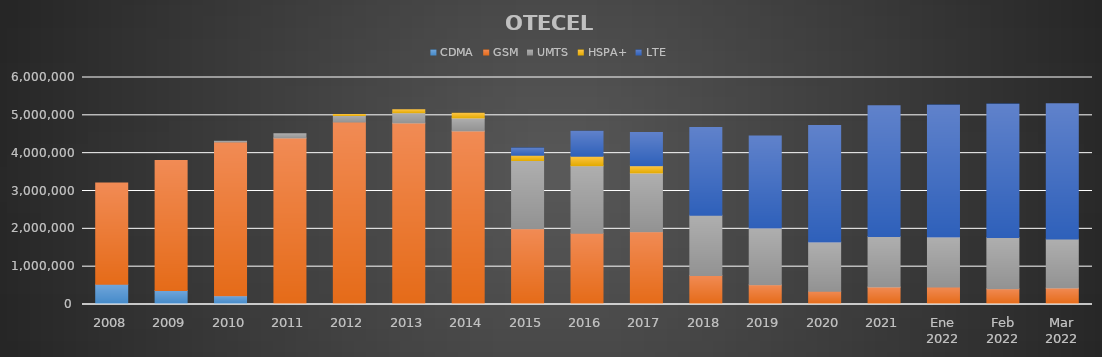
| Category | CDMA | GSM | UMTS | HSPA+ | LTE |
|---|---|---|---|---|---|
| 2008 | 533206 | 2678716 | 0 | 0 | 0 |
| 2009 | 370711 | 3435721 | 0 | 0 | 0 |
| 2010 | 232396 | 4061909 | 20294 | 0 | 0 |
| 2011 | 0 | 4403305 | 110569 | 0 | 0 |
| 2012 | 0 | 4823675 | 174375 | 21636 | 0 |
| 2013 | 0 | 4797632 | 272871 | 77805 | 0 |
| 2014 | 0 | 4589205 | 341647 | 124793 | 0 |
| 2015 | 0 | 2002436 | 1805322 | 136952 | 189988 |
| 2016 | 0 | 1881781 | 1787014 | 248541 | 662756 |
| 2017 | 0 | 1924184.634 | 1552693.066 | 187515.199 | 884631.101 |
| 2018 | 0 | 765658.891 | 1596404.415 | 0 | 2317582.694 |
| 2019 | 0 | 525011.505 | 1498097.705 | 0 | 2433246.79 |
| 2020 | 0 | 348601.621 | 1305745.099 | 0 | 3075378.28 |
| 2021 | 0 | 463116 | 1335075 | 0 | 3456277 |
| Ene 2022 | 0 | 461271.915 | 1324789.367 | 0 | 3486728.718 |
| Feb 2022 | 0 | 419568.449 | 1353562.987 | 0 | 3524816.564 |
| Mar 2022 | 0 | 438224.686 | 1291201.748 | 0 | 3579803.566 |